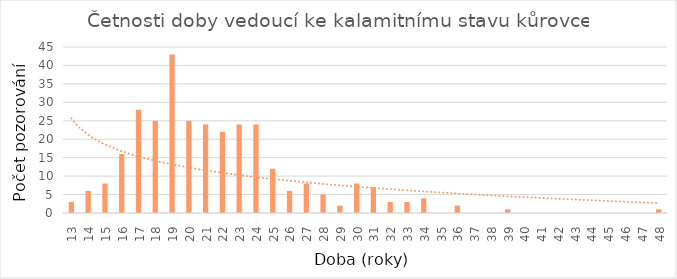
| Category | Četnosti doby |
|---|---|
| 13.0 | 3 |
| 14.0 | 6 |
| 15.0 | 8 |
| 16.0 | 16 |
| 17.0 | 28 |
| 18.0 | 25 |
| 19.0 | 43 |
| 20.0 | 25 |
| 21.0 | 24 |
| 22.0 | 22 |
| 23.0 | 24 |
| 24.0 | 24 |
| 25.0 | 12 |
| 26.0 | 6 |
| 27.0 | 8 |
| 28.0 | 5 |
| 29.0 | 2 |
| 30.0 | 8 |
| 31.0 | 7 |
| 32.0 | 3 |
| 33.0 | 3 |
| 34.0 | 4 |
| 35.0 | 0 |
| 36.0 | 2 |
| 37.0 | 0 |
| 38.0 | 0 |
| 39.0 | 1 |
| 40.0 | 0 |
| 41.0 | 0 |
| 42.0 | 0 |
| 43.0 | 0 |
| 44.0 | 0 |
| 45.0 | 0 |
| 46.0 | 0 |
| 47.0 | 0 |
| 48.0 | 1 |